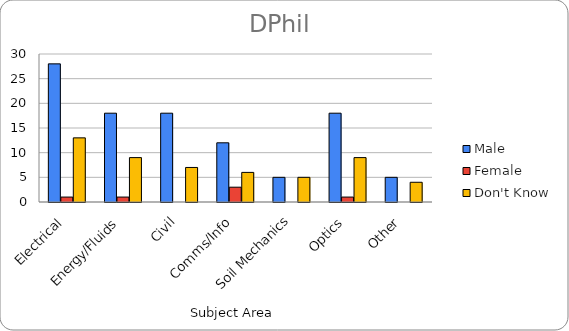
| Category | Male | Female | Don't Know |
|---|---|---|---|
| Electrical | 28 | 1 | 13 |
| Energy/Fluids | 18 | 1 | 9 |
| Civil | 18 | 0 | 7 |
| Comms/Info | 12 | 3 | 6 |
| Soil Mechanics | 5 | 0 | 5 |
| Optics | 18 | 1 | 9 |
| Other | 5 | 0 | 4 |